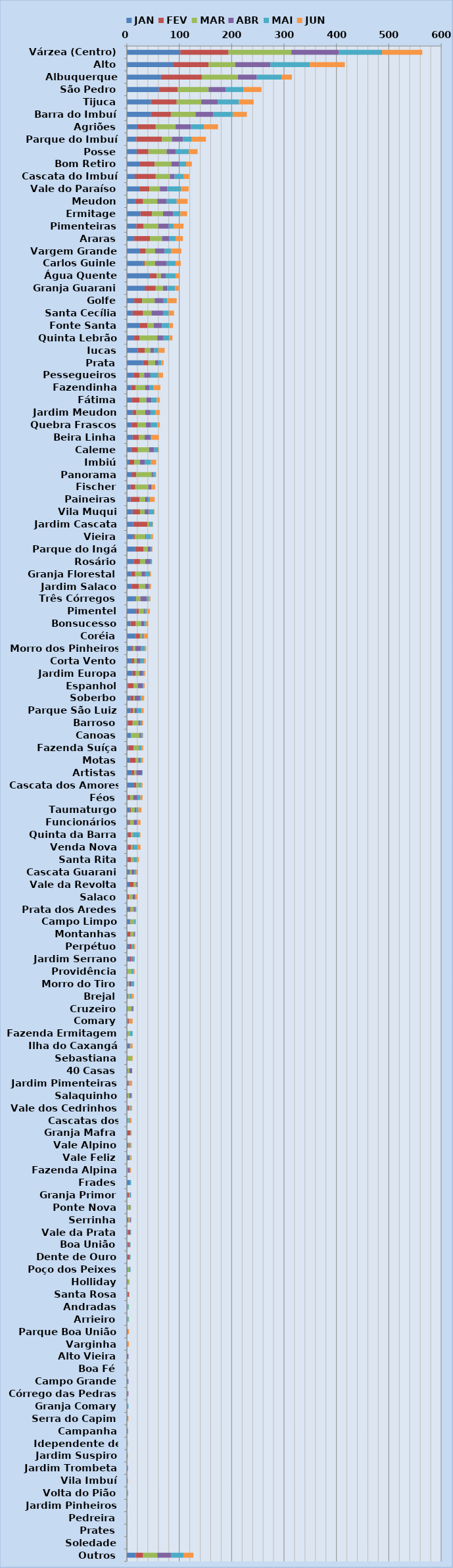
| Category | JAN | FEV | MAR | ABR | MAI | JUN |
|---|---|---|---|---|---|---|
| Várzea (Centro) | 102 | 92 | 120 | 91 | 82 | 77 |
| Alto | 88 | 68 | 51 | 67 | 75 | 67 |
| Albuquerque | 65 | 78 | 69 | 36 | 47 | 20 |
| São Pedro | 61 | 36 | 59 | 33 | 34 | 34 |
| Tijuca | 46 | 49 | 47 | 32 | 40 | 28 |
| Barra do Imbuí | 46 | 38 | 47 | 34 | 37 | 27 |
| Agriões | 20 | 35 | 38 | 29 | 25 | 27 |
| Parque do Imbuí | 18 | 49 | 19 | 21 | 17 | 27 |
| Posse | 19 | 22 | 35 | 17 | 25 | 17 |
| Bom Retiro | 25 | 28 | 32 | 15 | 13 | 11 |
| Cascata do Imbuí | 15 | 40 | 27 | 9 | 17 | 11 |
| Vale do Paraíso | 24 | 19 | 20 | 14 | 26 | 15 |
| Meudon | 16 | 15 | 27 | 18 | 19 | 21 |
| Ermitage | 26 | 22 | 21 | 19 | 14 | 13 |
| Pimenteiras | 18 | 14 | 28 | 20 | 9 | 19 |
| Araras | 14 | 30 | 23 | 14 | 12 | 14 |
| Vargem Grande | 25 | 11 | 18 | 18 | 12 | 20 |
| Carlos Guinle | 31 | 3 | 20 | 22 | 17 | 10 |
| Água Quente | 44 | 13 | 8 | 9 | 19 | 8 |
| Granja Guarani | 34 | 21 | 14 | 8 | 15 | 7 |
| Golfe | 14 | 15 | 24 | 17 | 7 | 18 |
| Santa Cecília | 11 | 20 | 16 | 22 | 11 | 10 |
| Fonte Santa | 24 | 15 | 12 | 16 | 14 | 7 |
| Quinta Lebrão | 14 | 10 | 34 | 11 | 12 | 6 |
| Iucas | 21 | 13 | 11 | 7 | 8 | 12 |
| Prata | 31 | 10 | 13 | 6 | 6 | 4 |
| Pessegueiros | 12 | 12 | 9 | 12 | 15 | 9 |
| Fazendinha | 8 | 9 | 18 | 8 | 8 | 13 |
| Fátima | 9 | 15 | 13 | 10 | 10 | 6 |
| Jardim Meudon | 11 | 7 | 17 | 10 | 9 | 9 |
| Quebra Frascos | 9 | 11 | 16 | 10 | 12 | 5 |
| Beira Linha | 11 | 12 | 11 | 11 | 2 | 14 |
| Caleme | 8 | 13 | 21 | 10 | 8 | 1 |
| Imbiú | 5 | 9 | 11 | 9 | 12 | 10 |
| Panorama | 10 | 8 | 29 | 3 | 5 | 1 |
| Fischer | 7 | 9 | 25 | 6 | 1 | 6 |
| Paineiras | 7 | 17 | 11 | 5 | 4 | 9 |
| Vila Muqui | 11 | 14 | 9 | 8 | 10 | 1 |
| Jardim Cascata | 12 | 27 | 4 | 1 | 5 | 1 |
| Vieira | 12 | 3 | 20 | 2 | 9 | 4 |
| Parque do Ingá | 16 | 16 | 8 | 5 | 3 | 1 |
| Rosário | 13 | 12 | 10 | 10 | 3 | 0 |
| Granja Florestal | 8 | 8 | 12 | 7 | 9 | 2 |
| Jardim Salaco | 9 | 14 | 12 | 7 | 2 | 2 |
| Três Córregos | 16 | 2 | 8 | 12 | 4 | 3 |
| Pimentel | 18 | 5 | 9 | 2 | 4 | 6 |
| Bonsucesso | 7 | 10 | 10 | 6 | 4 | 4 |
| Coréia | 17 | 8 | 4 | 1 | 3 | 7 |
| Morro dos Pinheiros | 10 | 2 | 4 | 11 | 7 | 3 |
| Corta Vento | 9 | 5 | 5 | 7 | 7 | 3 |
| Jardim Europa | 11 | 6 | 7 | 6 | 3 | 2 |
| Espanhol | 2 | 11 | 8 | 9 | 2 | 2 |
| Soberbo | 7 | 6 | 2 | 10 | 3 | 5 |
| Parque São Luiz | 7 | 5 | 3 | 4 | 9 | 4 |
| Barroso | 2 | 9 | 11 | 4 | 3 | 2 |
| Canoas | 8 | 0 | 16 | 3 | 3 | 1 |
| Fazenda Suíça | 3 | 10 | 10 | 1 | 4 | 3 |
| Motas | 6 | 11 | 5 | 3 | 3 | 3 |
| Artistas | 9 | 5 | 4 | 11 | 1 | 0 |
| Cascata dos Amores | 14 | 4 | 5 | 0 | 4 | 3 |
| Féos | 2 | 4 | 6 | 8 | 6 | 4 |
| Taumaturgo | 6 | 2 | 7 | 3 | 4 | 6 |
| Funcionários | 3 | 3 | 7 | 6 | 2 | 5 |
| Quinta da Barra | 2 | 6 | 3 | 1 | 12 | 2 |
| Venda Nova | 2 | 6 | 3 | 2 | 7 | 6 |
| Santa Rita | 2 | 6 | 4 | 1 | 6 | 4 |
| Cascata Guarani | 4 | 2 | 3 | 5 | 4 | 3 |
| Vale da Revolta | 5 | 8 | 5 | 2 | 0 | 1 |
| Salaco | 1 | 3 | 7 | 5 | 1 | 3 |
| Prata dos Aredes | 4 | 3 | 6 | 3 | 2 | 0 |
| Campo Limpo | 6 | 1 | 7 | 0 | 3 | 0 |
| Montanhas | 1 | 6 | 6 | 2 | 1 | 0 |
| Perpétuo | 4 | 5 | 1 | 0 | 4 | 2 |
| Jardim Serrano | 6 | 3 | 1 | 2 | 3 | 0 |
| Providência | 0 | 1 | 7 | 0 | 5 | 2 |
| Morro do Tiro | 2 | 1 | 1 | 5 | 5 | 0 |
| Brejal | 2 | 1 | 3 | 0 | 3 | 4 |
| Cruzeiro | 1 | 1 | 7 | 3 | 1 | 0 |
| Comary | 2 | 2 | 1 | 0 | 1 | 5 |
| Fazenda Ermitagem | 1 | 1 | 4 | 0 | 5 | 0 |
| Ilha do Caxangá | 4 | 2 | 0 | 0 | 1 | 4 |
| Sebastiana | 1 | 0 | 9 | 0 | 0 | 1 |
| 40 Casas | 2 | 0 | 3 | 5 | 0 | 0 |
| Jardim Pimenteiras | 3 | 1 | 1 | 0 | 1 | 4 |
| Salaquinho | 0 | 2 | 3 | 3 | 2 | 0 |
| Vale dos Cedrinhos | 2 | 2 | 3 | 1 | 1 | 1 |
| Cascatas dos Amores | 2 | 0 | 1 | 0 | 3 | 3 |
| Granja Mafra | 1 | 6 | 1 | 0 | 1 | 0 |
| Vale Alpino | 1 | 2 | 1 | 1 | 2 | 2 |
| Vale Feliz | 4 | 1 | 2 | 0 | 0 | 2 |
| Fazenda Alpina | 1 | 0 | 1 | 3 | 1 | 2 |
| Frades | 5 | 0 | 0 | 0 | 3 | 0 |
| Granja Primor | 1 | 3 | 1 | 1 | 2 | 0 |
| Ponte Nova | 2 | 0 | 3 | 1 | 1 | 1 |
| Serrinha | 1 | 2 | 3 | 2 | 0 | 0 |
| Vale da Prata | 2 | 3 | 0 | 2 | 1 | 0 |
| Boa União | 2 | 2 | 0 | 2 | 1 | 0 |
| Dente de Ouro | 1 | 3 | 0 | 1 | 2 | 0 |
| Poço dos Peixes | 1 | 1 | 2 | 0 | 3 | 0 |
| Holliday | 0 | 2 | 3 | 0 | 0 | 0 |
| Santa Rosa | 2 | 2 | 0 | 0 | 0 | 1 |
| Andradas | 1 | 0 | 2 | 0 | 1 | 0 |
| Arrieiro | 1 | 0 | 2 | 0 | 1 | 0 |
| Parque Boa União | 0 | 2 | 0 | 0 | 0 | 2 |
| Varginha | 0 | 1 | 0 | 0 | 0 | 3 |
| Alto Vieira | 0 | 0 | 0 | 3 | 0 | 0 |
| Boa Fé | 1 | 0 | 1 | 1 | 0 | 0 |
| Campo Grande | 2 | 0 | 0 | 1 | 0 | 0 |
| Córrego das Pedras | 0 | 2 | 0 | 1 | 0 | 0 |
| Granja Comary | 0 | 0 | 0 | 0 | 3 | 0 |
| Serra do Capim | 1 | 0 | 0 | 1 | 0 | 1 |
| Campanha | 1 | 0 | 0 | 1 | 0 | 0 |
| Idependente de Motas | 0 | 0 | 2 | 0 | 0 | 0 |
| Jardim Suspiro | 0 | 1 | 0 | 0 | 0 | 1 |
| Jardim Trombeta | 2 | 0 | 0 | 0 | 0 | 0 |
| Vila Imbuí | 0 | 0 | 0 | 1 | 0 | 1 |
| Volta do Pião | 0 | 0 | 1 | 1 | 0 | 0 |
| Jardim Pinheiros | 0 | 0 | 0 | 0 | 1 | 0 |
| Pedreira | 0 | 0 | 1 | 0 | 0 | 0 |
| Prates | 0 | 0 | 1 | 0 | 0 | 0 |
| Soledade | 0 | 0 | 0 | 0 | 0 | 1 |
| Outros | 17 | 14 | 27 | 26 | 24 | 19 |